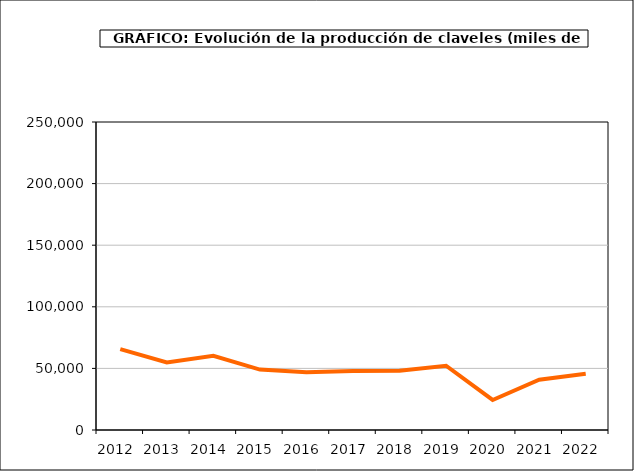
| Category | producción |
|---|---|
| 2012.0 | 65631 |
| 2013.0 | 54800 |
| 2014.0 | 60277 |
| 2015.0 | 49065 |
| 2016.0 | 46856 |
| 2017.0 | 47990 |
| 2018.0 | 48043 |
| 2019.0 | 52184 |
| 2020.0 | 24363 |
| 2021.0 | 40789 |
| 2022.0 | 45726 |